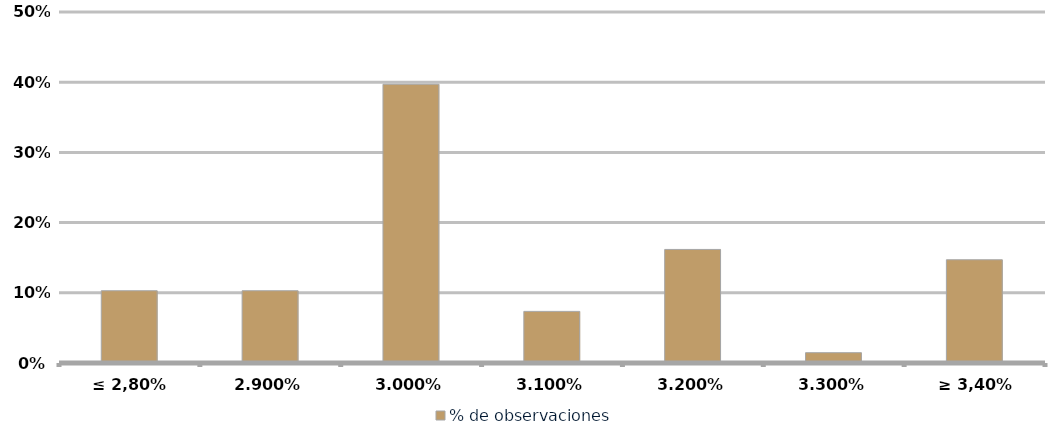
| Category | % de observaciones  |
|---|---|
| ≤ 2,80% | 0.103 |
| 2,90% | 0.103 |
| 3,00% | 0.397 |
| 3,10% | 0.074 |
| 3,20% | 0.162 |
| 3,30% | 0.015 |
| ≥ 3,40% | 0.147 |